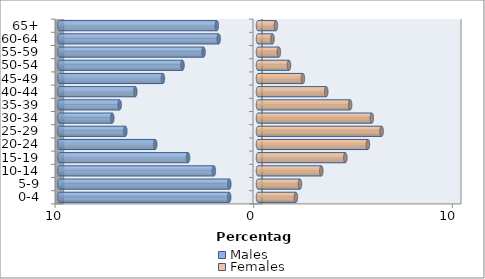
| Category | Males | Females |
|---|---|---|
| 0-4 | -1.45 | 1.907 |
| 5-9 | -1.443 | 2.112 |
| 10-14 | -2.221 | 3.187 |
| 15-19 | -3.522 | 4.395 |
| 20-24 | -5.173 | 5.534 |
| 25-29 | -6.677 | 6.222 |
| 30-34 | -7.335 | 5.729 |
| 35-39 | -6.964 | 4.638 |
| 40-44 | -6.175 | 3.436 |
| 45-49 | -4.787 | 2.258 |
| 50-54 | -3.801 | 1.561 |
| 55-59 | -2.742 | 1.048 |
| 60-64 | -1.979 | 0.73 |
| 65+ | -2.074 | 0.9 |